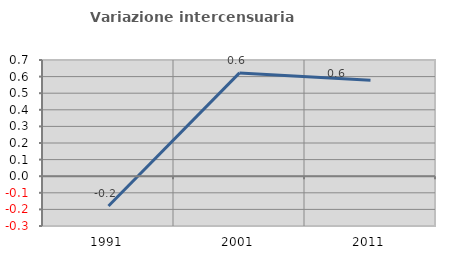
| Category | Variazione intercensuaria annua |
|---|---|
| 1991.0 | -0.18 |
| 2001.0 | 0.622 |
| 2011.0 | 0.578 |